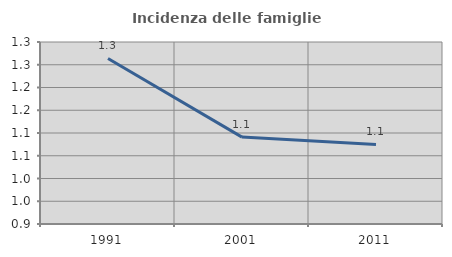
| Category | Incidenza delle famiglie numerose |
|---|---|
| 1991.0 | 1.264 |
| 2001.0 | 1.091 |
| 2011.0 | 1.075 |